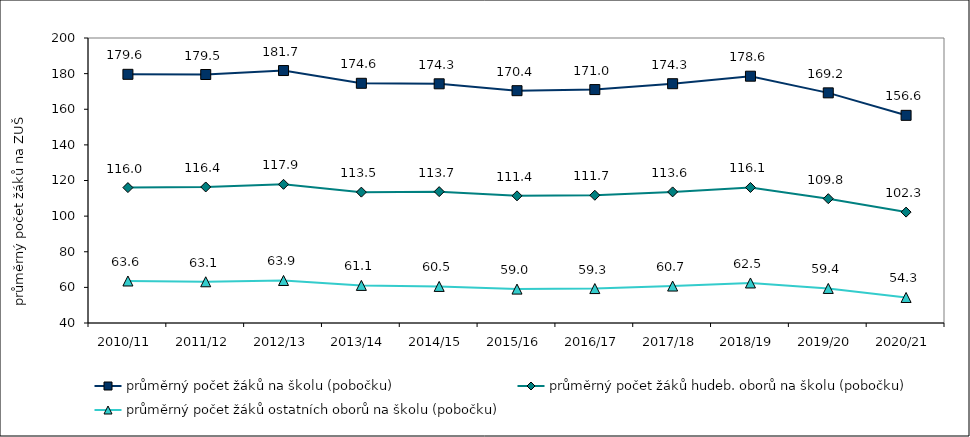
| Category | průměrný počet žáků na školu (pobočku) | průměrný počet žáků hudeb. oborů na školu (pobočku) | průměrný počet žáků ostatních oborů na školu (pobočku) |
|---|---|---|---|
| 2010/11 | 179.606 | 116.018 | 63.587 |
| 2011/12 | 179.508 | 116.364 | 63.144 |
| 2012/13 | 181.731 | 117.854 | 63.877 |
| 2013/14 | 174.577 | 113.469 | 61.108 |
| 2014/15 | 174.286 | 113.746 | 60.54 |
| 2015/16 | 170.423 | 111.393 | 59.03 |
| 2016/17 | 171.042 | 111.712 | 59.33 |
| 2017/18 | 174.336 | 113.598 | 60.738 |
| 2018/19 | 178.553 | 116.084 | 62.469 |
| 2019/20 | 169.204 | 109.795 | 59.409 |
| 2020/21 | 156.587 | 102.26 | 54.327 |